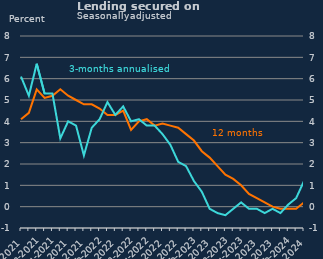
| Category | 12-month |
|---|---|
| Apr-2021 | 4.1 |
| May-2021 | 4.4 |
| Jun-2021 | 5.5 |
| Jul-2021 | 5.1 |
| Aug-2021 | 5.2 |
| Sep-2021 | 5.5 |
| Oct-2021 | 5.2 |
| Nov-2021 | 5 |
| Dec-2021 | 4.8 |
| Jan-2022 | 4.8 |
| Feb-2022 | 4.6 |
| Mar-2022 | 4.3 |
| Apr-2022 | 4.3 |
| May-2022 | 4.5 |
| Jun-2022 | 3.6 |
| Jul-2022 | 4 |
| Aug-2022 | 4.1 |
| Sep-2022 | 3.8 |
| Oct-2022 | 3.9 |
| Nov-2022 | 3.8 |
| Dec-2022 | 3.7 |
| Jan-2023 | 3.4 |
| Feb-2023 | 3.1 |
| Mar-2023 | 2.6 |
| Apr-2023 | 2.3 |
| May-2023 | 1.9 |
| Jun-2023 | 1.5 |
| Jul-2023 | 1.3 |
| Aug-2023 | 1 |
| Sep-2023 | 0.6 |
| Oct-2023 | 0.4 |
| Nov-2023 | 0.2 |
| Dec-2023 | 0 |
| Jan-2024 | -0.1 |
| Feb-2024 | -0.1 |
| Mar-2024 | -0.1 |
| Apr-2024 | 0.2 |